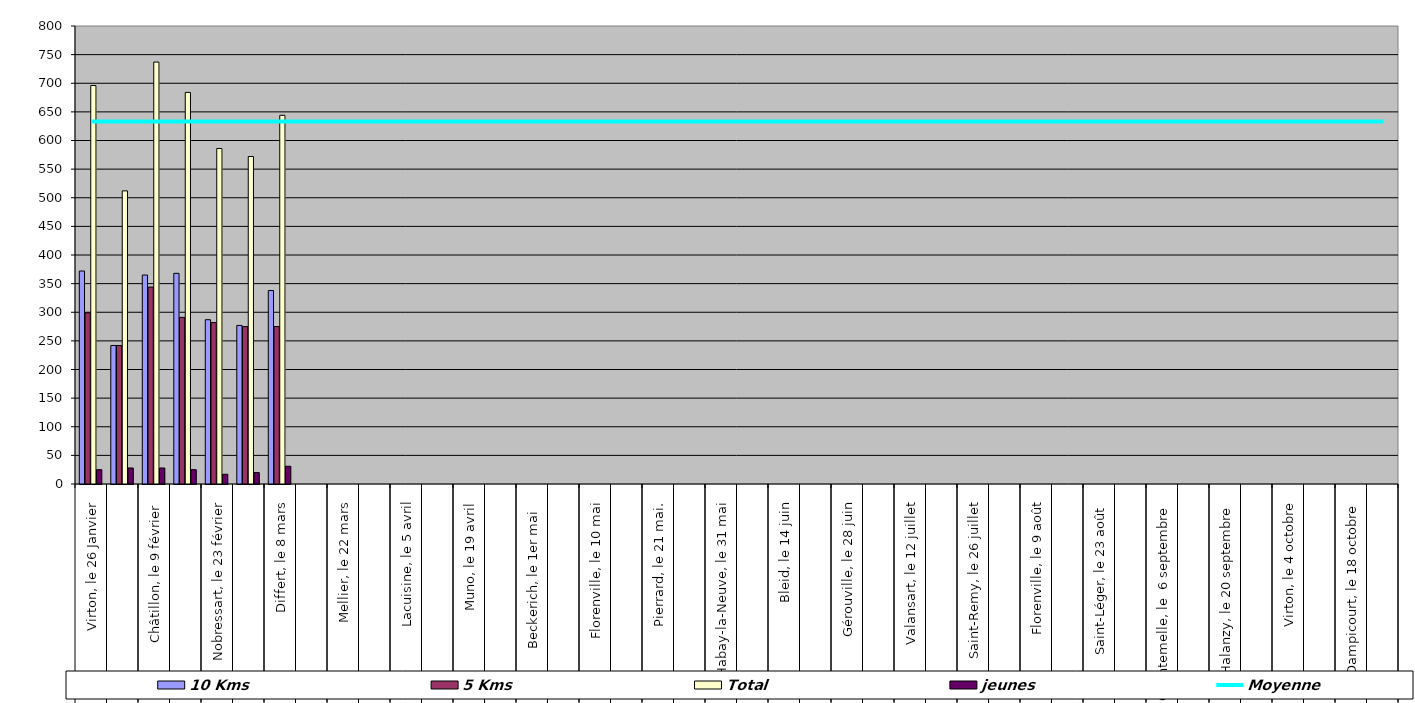
| Category | 10 Kms | 5 Kms | Total | jeunes |
|---|---|---|---|---|
| 0 | 372 | 299 | 696 | 25 |
| 1 | 242 | 242 | 512 | 28 |
| 2 | 365 | 344 | 737 | 28 |
| 3 | 368 | 291 | 684 | 25 |
| 4 | 287 | 282 | 586 | 17 |
| 5 | 277 | 275 | 572 | 20 |
| 6 | 338 | 275 | 644 | 31 |
| 7 | 0 | 0 | 0 | 0 |
| 8 | 0 | 0 | 0 | 0 |
| 9 | 0 | 0 | 0 | 0 |
| 10 | 0 | 0 | 0 | 0 |
| 11 | 0 | 0 | 0 | 0 |
| 12 | 0 | 0 | 0 | 0 |
| 13 | 0 | 0 | 0 | 0 |
| 14 | 0 | 0 | 0 | 0 |
| 15 | 0 | 0 | 0 | 0 |
| 16 | 0 | 0 | 0 | 0 |
| 17 | 0 | 0 | 0 | 0 |
| 18 | 0 | 0 | 0 | 0 |
| 19 | 0 | 0 | 0 | 0 |
| 20 | 0 | 0 | 0 | 0 |
| 21 | 0 | 0 | 0 | 0 |
| 22 | 0 | 0 | 0 | 0 |
| 23 | 0 | 0 | 0 | 0 |
| 24 | 0 | 0 | 0 | 0 |
| 25 | 0 | 0 | 0 | 0 |
| 26 | 0 | 0 | 0 | 0 |
| 27 | 0 | 0 | 0 | 0 |
| 28 | 0 | 0 | 0 | 0 |
| 29 | 0 | 0 | 0 | 0 |
| 30 | 0 | 0 | 0 | 0 |
| 31 | 0 | 0 | 0 | 0 |
| 32 | 0 | 0 | 0 | 0 |
| 33 | 0 | 0 | 0 | 0 |
| 34 | 0 | 0 | 0 | 0 |
| 35 | 0 | 0 | 0 | 0 |
| 36 | 0 | 0 | 0 | 0 |
| 37 | 0 | 0 | 0 | 0 |
| 38 | 0 | 0 | 0 | 0 |
| 39 | 0 | 0 | 0 | 0 |
| 40 | 0 | 0 | 0 | 0 |
| 41 | 0 | 0 | 0 | 0 |